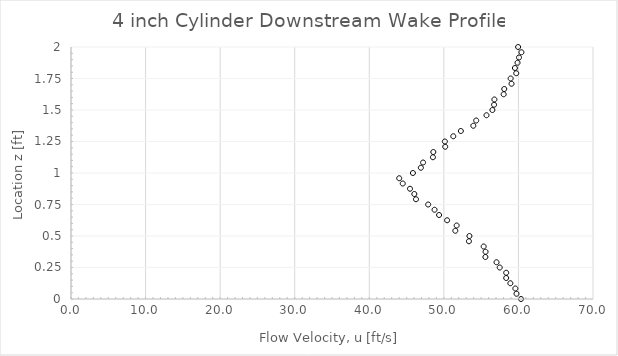
| Category | Series 0 |
|---|---|
| 60.347190933166566 | 0 |
| 59.74418555411847 | 0.042 |
| 59.587580694919566 | 0.083 |
| 58.917366299378635 | 0.125 |
| 58.359645998543414 | 0.167 |
| 58.359645998543414 | 0.208 |
| 57.492613729061766 | 0.25 |
| 57.06439174707999 | 0.292 |
| 55.57115614598757 | 0.333 |
| 55.59217019696349 | 0.375 |
| 55.3394749300269 | 0.417 |
| 53.36240473723171 | 0.458 |
| 53.42802836301747 | 0.5 |
| 51.53634553607208 | 0.542 |
| 51.71733602637324 | 0.583 |
| 50.43676540486213 | 0.625 |
| 49.360021083966565 | 0.667 |
| 48.752885969405234 | 0.708 |
| 47.894845038039335 | 0.75 |
| 46.26238126550715 | 0.792 |
| 46.03966976921774 | 0.833 |
| 45.460138346168854 | 0.875 |
| 44.48622804545174 | 0.917 |
| 44.013750492056 | 0.958 |
| 45.85155235203153 | 1 |
| 46.91670604915476 | 1.042 |
| 47.21450209607082 | 1.083 |
| 48.53438332674453 | 1.125 |
| 48.58729820520492 | 1.167 |
| 50.18138494137483 | 1.208 |
| 50.1348123664744 | 1.25 |
| 51.263661686777084 | 1.292 |
| 52.27889288063957 | 1.333 |
| 53.95014381921108 | 1.375 |
| 54.338438242455766 | 1.417 |
| 55.718088068837176 | 1.458 |
| 56.509052608328005 | 1.5 |
| 56.73595805625775 | 1.542 |
| 56.77711616641238 | 1.583 |
| 58.01841449372869 | 1.625 |
| 58.098884564092984 | 1.667 |
| 59.07574786751789 | 1.708 |
| 58.957001579693696 | 1.75 |
| 59.70507284906443 | 1.792 |
| 59.52874765736535 | 1.833 |
| 59.880878835984866 | 1.875 |
| 60.075615421185105 | 1.917 |
| 60.40522683463187 | 1.958 |
| 59.95884936684154 | 2 |